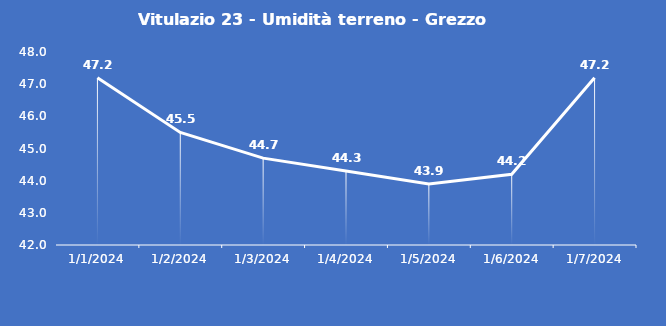
| Category | Vitulazio 23 - Umidità terreno - Grezzo (%VWC) |
|---|---|
| 1/1/24 | 47.2 |
| 1/2/24 | 45.5 |
| 1/3/24 | 44.7 |
| 1/4/24 | 44.3 |
| 1/5/24 | 43.9 |
| 1/6/24 | 44.2 |
| 1/7/24 | 47.2 |